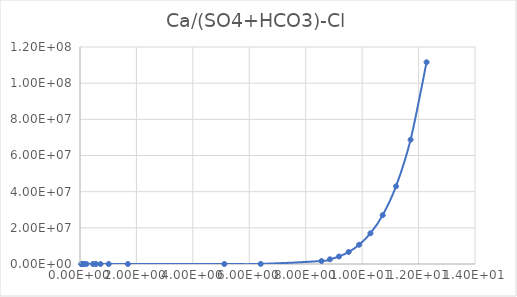
| Category | Series 0 |
|---|---|
| 0.045806 | 1.687 |
| 0.050896 | 1.695 |
| 0.057272 | 1.706 |
| 0.065473 | 1.719 |
| 0.076393 | 1.736 |
| 0.091717 | 1.758 |
| 0.11468 | 1.791 |
| 0.15308 | 1.843 |
| 0.22991 | 1.951 |
| 0.46246 | 2.339 |
| 0.56529 | 2.553 |
| 0.72693 | 2.963 |
| 1.018 | 4.016 |
| 1.6979 | 9.732 |
| 5.1148 | 4025.727 |
| 6.4035 | 41269.378 |
| 8.5602 | 1651606.221 |
| 8.8586 | 2607949.107 |
| 9.1785 | 4153708.22 |
| 9.5223 | 6643711.415 |
| 9.893 | 10631180.091 |
| 10.294 | 16969744.281 |
| 10.728 | 27012155.482 |
| 11.201 | 42977036.81 |
| 11.717 | 68730813.392 |
| 12.283 | 111568373.207 |